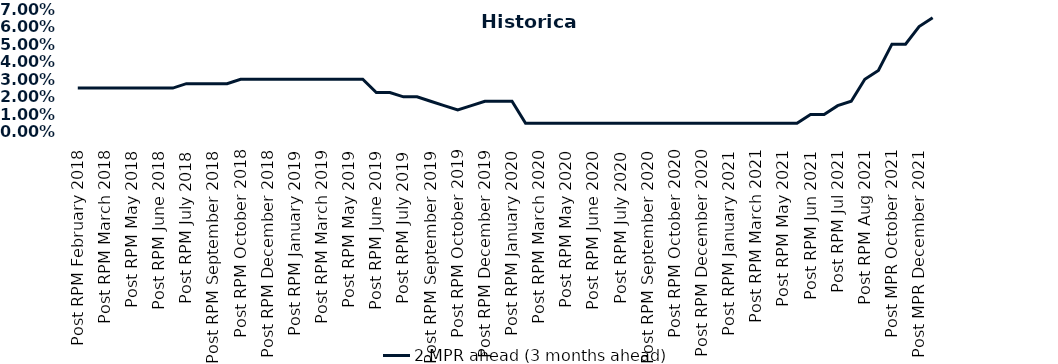
| Category | 2 MPR ahead (3 months ahead) |
|---|---|
| Post RPM February 2018 | 0.025 |
| Pre RPM March 2018 | 0.025 |
| Post RPM March 2018 | 0.025 |
| Pre RPM May 2018 | 0.025 |
| Post RPM May 2018 | 0.025 |
| Pre RPM June 2018 | 0.025 |
| Post RPM June 2018 | 0.025 |
| Pre RPM July 2018 | 0.025 |
| Post RPM July 2018 | 0.028 |
| Pre RPM September 2018 | 0.028 |
| Post RPM September 2018 | 0.028 |
| Pre RPM October 2018 | 0.028 |
| Post RPM October 2018 | 0.03 |
| Pre RPM December 2018 | 0.03 |
| Post RPM December 2018 | 0.03 |
| Pre RPM January 2019 | 0.03 |
| Post RPM January 2019 | 0.03 |
| Pre RPM March 2019 | 0.03 |
| Post RPM March 2019 | 0.03 |
| Pre RPM May 2019 | 0.03 |
| Post RPM May 2019 | 0.03 |
| Pre RPM June 2019 | 0.03 |
| Post RPM June 2019 | 0.022 |
| Pre RPM July 2019 | 0.022 |
| Post RPM July 2019 | 0.02 |
| Pre RPM September 2019 | 0.02 |
| Post RPM September 2019 | 0.018 |
| Pre RPM October 2019 | 0.015 |
| Post RPM October 2019 | 0.012 |
| Pre RPM December 2019 | 0.015 |
| Post RPM December 2019 | 0.018 |
| Pre RPM January 2020 | 0.018 |
| Post RPM January 2020 | 0.018 |
| Pre RPM March 2020 | 0.005 |
| Post RPM March 2020 | 0.005 |
| Pre RPM May 2020 | 0.005 |
| Post RPM May 2020 | 0.005 |
| Pre RPM June 2020 | 0.005 |
| Post RPM June 2020 | 0.005 |
| Pre RPM July 2020 | 0.005 |
| Post RPM July 2020 | 0.005 |
| Pre RPM September 2020 | 0.005 |
| Post RPM September 2020 | 0.005 |
| Pre RPM October 2020 | 0.005 |
| Post RPM October 2020 | 0.005 |
| Pre RPM December 2020 | 0.005 |
|  Post RPM December 2020 | 0.005 |
| Pre RPM January 2021 | 0.005 |
| Post RPM January 2021 | 0.005 |
|  Pre RPM March 2021 | 0.005 |
|  Post RPM March 2021 | 0.005 |
|  Pre RPM May 2021 | 0.005 |
|  Post RPM May 2021 | 0.005 |
|  Pre RPM Jun 2021 | 0.005 |
|   Post RPM Jun 2021 | 0.01 |
| Pre RPM Jul 2021 | 0.01 |
|  Post RPM Jul 2021 | 0.015 |
| Pre RPM Aug 2021 | 0.018 |
|  Post RPM Aug 2021 | 0.03 |
| Pre MPR October 2021 | 0.035 |
| Post MPR October 2021 | 0.05 |
| Pre MPR December 2021 | 0.05 |
| Post MPR December 2021 | 0.06 |
| Pre MPR January 2022 | 0.065 |